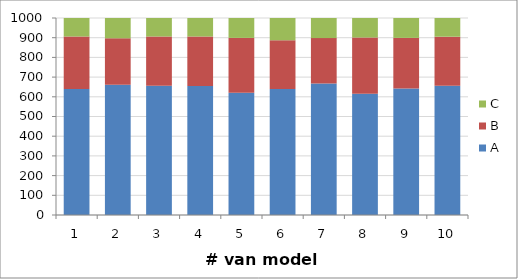
| Category | A | B | C |
|---|---|---|---|
| 1.0 | 640 | 266 | 94 |
| 2.0 | 661 | 236 | 103 |
| 3.0 | 656 | 250 | 94 |
| 4.0 | 655 | 251 | 94 |
| 5.0 | 621 | 278 | 101 |
| 6.0 | 639 | 248 | 113 |
| 7.0 | 668 | 230 | 102 |
| 8.0 | 615 | 286 | 99 |
| 9.0 | 642 | 257 | 101 |
| 10.0 | 656 | 249 | 95 |